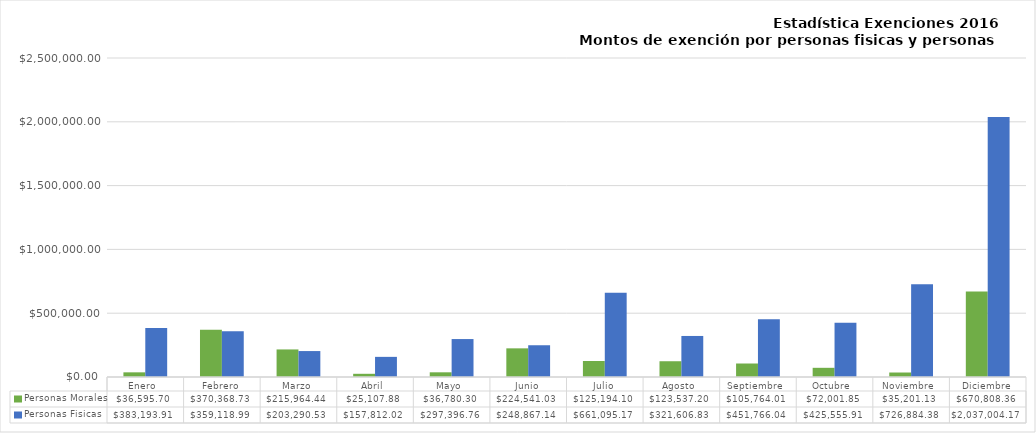
| Category | Personas Morales | Personas Fisicas |
|---|---|---|
| Enero  | 36595.7 | 383193.91 |
| Febrero | 370368.73 | 359118.99 |
| Marzo | 215964.44 | 203290.53 |
| Abril  | 25107.88 | 157812.02 |
| Mayo  | 36780.3 | 297396.76 |
| Junio | 224541.03 | 248867.14 |
| Julio | 125194.1 | 661095.17 |
| Agosto  | 123537.2 | 321606.83 |
| Septiembre  | 105764.01 | 451766.04 |
| Octubre  | 72001.85 | 425555.91 |
| Noviembre  | 35201.13 | 726884.38 |
| Diciembre | 670808.36 | 2037004.17 |